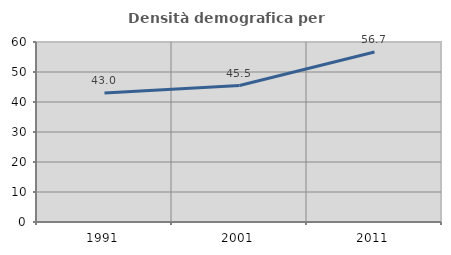
| Category | Densità demografica |
|---|---|
| 1991.0 | 43.001 |
| 2001.0 | 45.48 |
| 2011.0 | 56.684 |